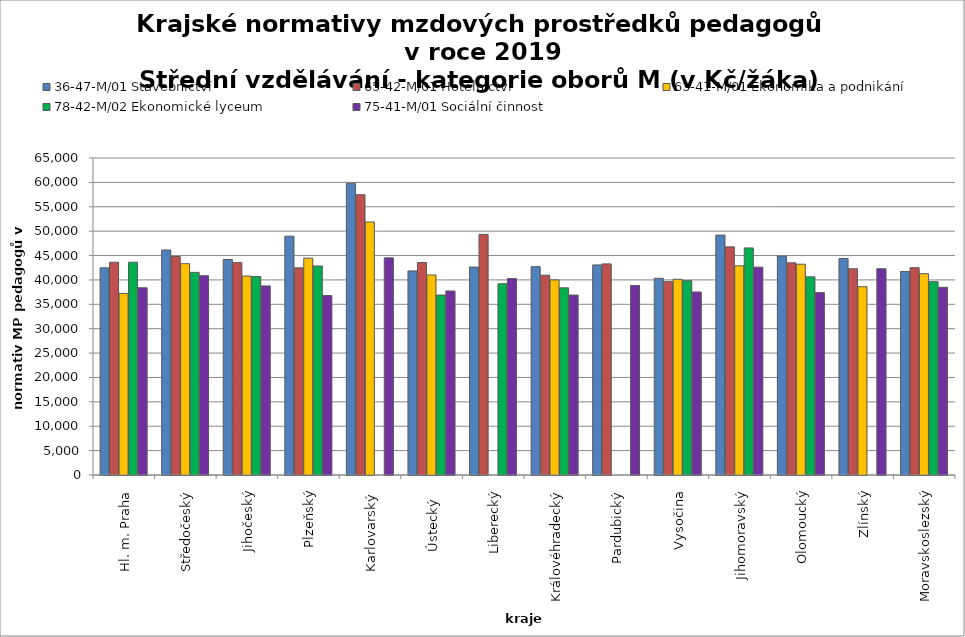
| Category | 36-47-M/01 Stavebnictví | 65-42-M/01 Hotelnictví | 63-41-M/01 Ekonomika a podnikání | 78-42-M/02 Ekonomické lyceum | 75-41-M/01 Sociální činnost |
|---|---|---|---|---|---|
| Hl. m. Praha | 42477.876 | 43636.364 | 37238.169 | 43636.364 | 38400 |
| Středočeský | 46139.768 | 44806.239 | 43331.684 | 41545.843 | 40862.234 |
| Jihočeský | 44187.983 | 43558.938 | 40798.957 | 40692.801 | 38775.868 |
| Plzeňský | 48966.942 | 42473.118 | 44465.291 | 42857.143 | 36801.242 |
| Karlovarský  | 59840 | 57464.789 | 51884.393 | 0 | 44523.81 |
| Ústecký   | 41849.566 | 43572.289 | 41018.904 | 36903.061 | 37737.391 |
| Liberecký | 42634.147 | 49337.726 | 0 | 39217.79 | 40287.242 |
| Královéhradecký | 42716.435 | 40966.696 | 40004.87 | 38373.737 | 36893.023 |
| Pardubický | 43084.528 | 43288.72 | 0 | 0 | 38867.745 |
| Vysočina | 40337.834 | 39645.647 | 40137.612 | 39847.749 | 37529.647 |
| Jihomoravský | 49191.726 | 46779.116 | 42896.118 | 46564.124 | 42617.884 |
| Olomoucký | 44895.652 | 43497.802 | 43220.746 | 40632.678 | 37401.26 |
| Zlínský | 44403.6 | 42289.143 | 38611.826 | 0 | 42289.143 |
| Moravskoslezský | 41734.605 | 42508.834 | 41269.297 | 39637.562 | 38496 |